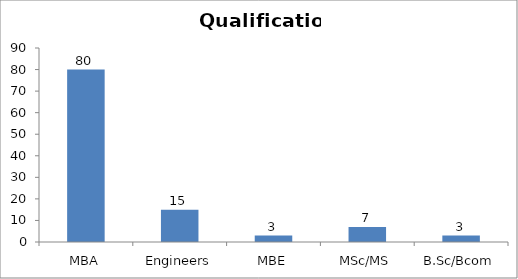
| Category | Qualification |
|---|---|
| MBA | 80 |
| Engineers | 15 |
| MBE | 3 |
| MSc/MS | 7 |
| B.Sc/Bcom | 3 |